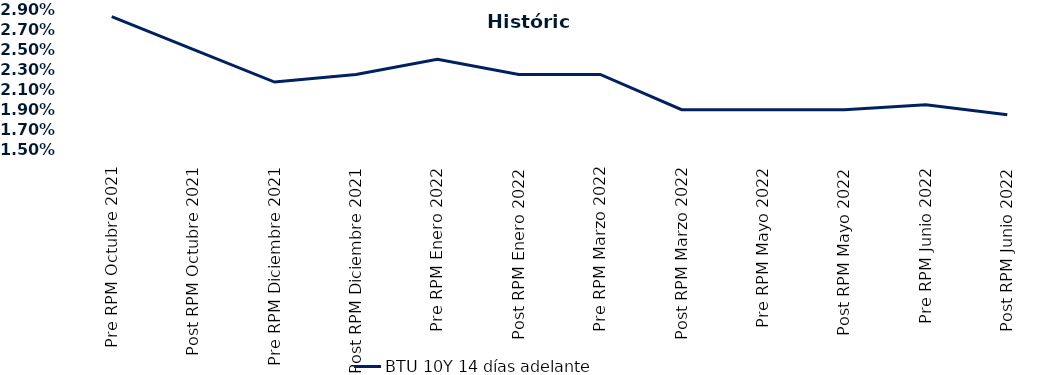
| Category | BTU 10Y 14 días adelante |
|---|---|
| Pre RPM Octubre 2021 | 0.028 |
| Post RPM Octubre 2021 | 0.025 |
| Pre RPM Diciembre 2021 | 0.022 |
| Post RPM Diciembre 2021 | 0.022 |
| Pre RPM Enero 2022 | 0.024 |
| Post RPM Enero 2022 | 0.022 |
| Pre RPM Marzo 2022 | 0.022 |
| Post RPM Marzo 2022 | 0.019 |
| Pre RPM Mayo 2022 | 0.019 |
| Post RPM Mayo 2022 | 0.019 |
| Pre RPM Junio 2022 | 0.02 |
| Post RPM Junio 2022 | 0.018 |